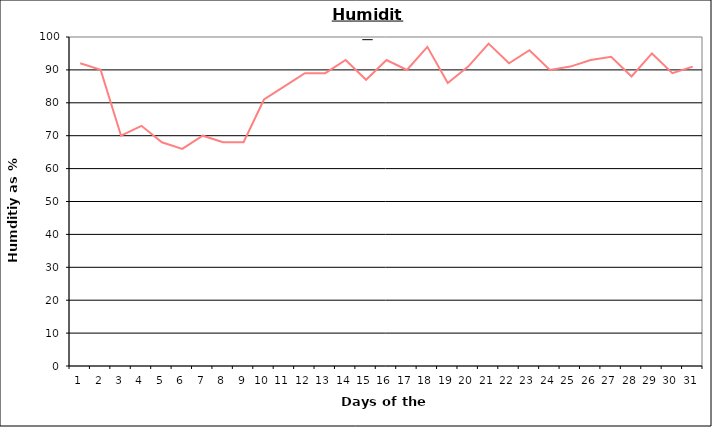
| Category | Series 0 |
|---|---|
| 0 | 92 |
| 1 | 90 |
| 2 | 70 |
| 3 | 73 |
| 4 | 68 |
| 5 | 66 |
| 6 | 70 |
| 7 | 68 |
| 8 | 68 |
| 9 | 81 |
| 10 | 85 |
| 11 | 89 |
| 12 | 89 |
| 13 | 93 |
| 14 | 87 |
| 15 | 93 |
| 16 | 90 |
| 17 | 97 |
| 18 | 86 |
| 19 | 91 |
| 20 | 98 |
| 21 | 92 |
| 22 | 96 |
| 23 | 90 |
| 24 | 91 |
| 25 | 93 |
| 26 | 94 |
| 27 | 88 |
| 28 | 95 |
| 29 | 89 |
| 30 | 91 |